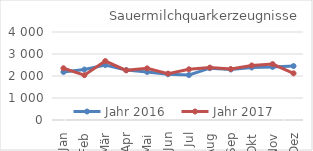
| Category | Jahr 2016 | Jahr 2017 |
|---|---|---|
| Jan | 2183.299 | 2352.559 |
| Feb | 2294.091 | 2037.129 |
| Mär | 2497.542 | 2679.365 |
| Apr | 2268.605 | 2256.081 |
| Mai | 2183.56 | 2348.672 |
| Jun | 2080.175 | 2109.069 |
| Jul | 2043.73 | 2304.348 |
| Aug | 2355.038 | 2381.012 |
| Sep | 2295.075 | 2315.14 |
| Okt | 2386.612 | 2479.508 |
| Nov | 2412.249 | 2541.235 |
| Dez | 2452.152 | 2121.456 |